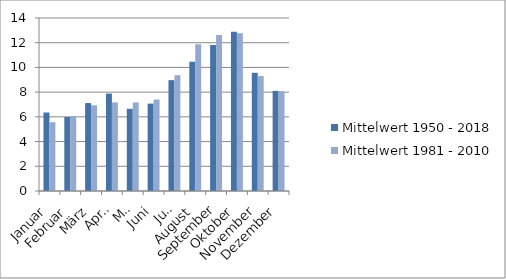
| Category | Mittelwert 1950 - 2018 | Mittelwert 1981 - 2010 |
|---|---|---|
| Januar | 6.353 | 5.567 |
| Februar | 5.986 | 6.067 |
| März | 7.116 | 6.933 |
| April | 7.884 | 7.167 |
| Mai | 6.652 | 7.167 |
| Juni | 7.072 | 7.4 |
| Juli | 8.971 | 9.367 |
| August | 10.464 | 11.867 |
| September | 11.812 | 12.633 |
| Oktober | 12.884 | 12.767 |
| November | 9.565 | 9.3 |
| Dezember | 8.101 | 8.067 |